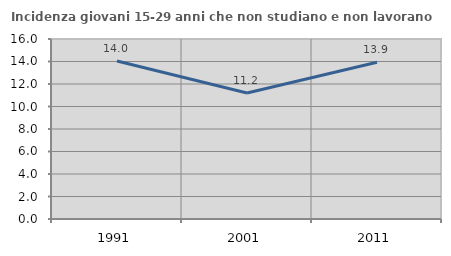
| Category | Incidenza giovani 15-29 anni che non studiano e non lavorano  |
|---|---|
| 1991.0 | 14.04 |
| 2001.0 | 11.195 |
| 2011.0 | 13.937 |